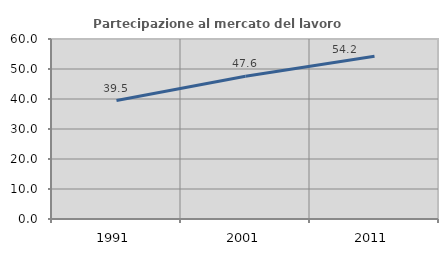
| Category | Partecipazione al mercato del lavoro  femminile |
|---|---|
| 1991.0 | 39.497 |
| 2001.0 | 47.587 |
| 2011.0 | 54.229 |